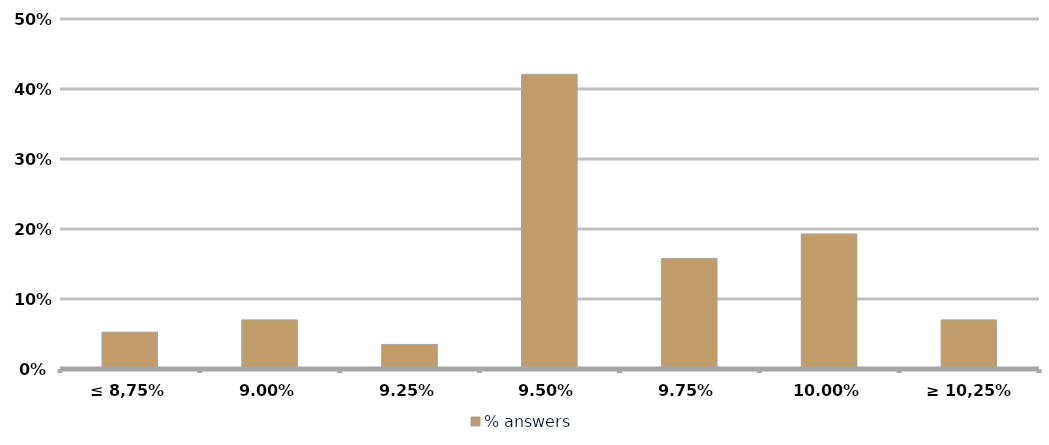
| Category | % answers |
|---|---|
| ≤ 8,75% | 0.053 |
| 9,00% | 0.07 |
| 9,25% | 0.035 |
| 9,50% | 0.421 |
| 9,75% | 0.158 |
| 10,00% | 0.193 |
| ≥ 10,25% | 0.07 |